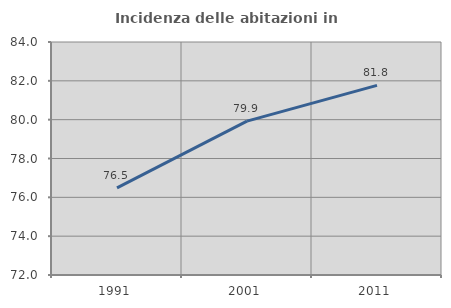
| Category | Incidenza delle abitazioni in proprietà  |
|---|---|
| 1991.0 | 76.489 |
| 2001.0 | 79.927 |
| 2011.0 | 81.768 |